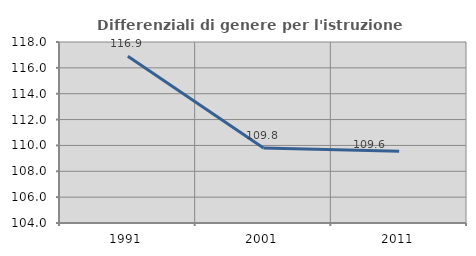
| Category | Differenziali di genere per l'istruzione superiore |
|---|---|
| 1991.0 | 116.906 |
| 2001.0 | 109.803 |
| 2011.0 | 109.553 |